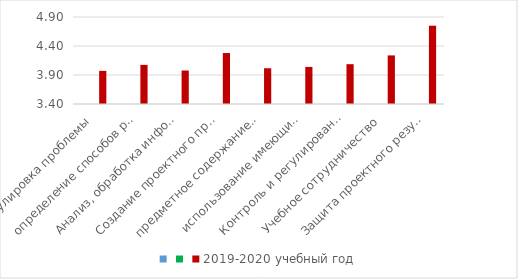
| Category | Series 0 | Series 1 | 2019-2020 учебный год |
|---|---|---|---|
| Формулировка проблемы |  |  | 3.971 |
| определение способов решения проблемы  |  |  | 4.074 |
| Анализ, обработка информации |  |  | 3.977 |
| Создание проектного продукта |  |  | 4.279 |
| предметное содержание проекта  |  |  | 4.017 |
| использование имеющихся способов |  |  | 4.039 |
| Контроль и регулирование проектной де |  |  | 4.086 |
| Учебное сотрудничество |  |  | 4.238 |
| Защита проектного результата |  |  | 4.75 |